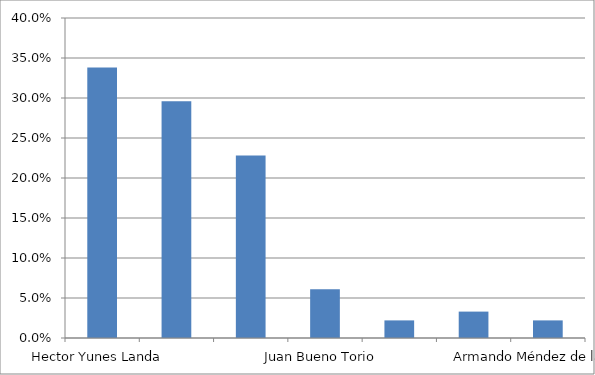
| Category | Series 0 |
|---|---|
| Hector Yunes Landa  | 0.338 |
| Miguel Angel Yunes Linares  | 0.296 |
| Cuitáhuac García Jimenez  | 0.228 |
| Juan Bueno Torio  | 0.061 |
| Alba Leonila Méndez  | 0.022 |
| Victor A Vázquez Cuevas "PIPO" | 0.033 |
| Armando Méndez de la Luz  | 0.022 |